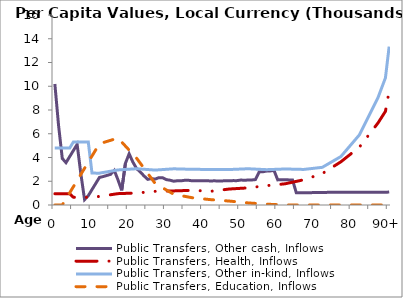
| Category | Public Transfers, Other cash, Inflows | Public Transfers, Health, Inflows | Public Transfers, Other in-kind, Inflows | Public Transfers, Education, Inflows |
|---|---|---|---|---|
| 0 | 10192.285 | 951.171 | 4802.337 | 0 |
|  | 6693.312 | 951 | 4801.83 | 0 |
| 2 | 3918.849 | 951.171 | 4801.421 | 0 |
| 3 | 3564.924 | 951.065 | 4800.856 | 515.8 |
| 4 | 4078.992 | 951.213 | 4800.2 | 1031.6 |
| 5 | 4592.577 | 649.565 | 5312.809 | 1547.4 |
| 6 | 5106.225 | 649.549 | 5311.987 | 2063.201 |
| 7 | 2623.115 | 649.444 | 5311.131 | 2579.001 |
| 8 | 455.655 | 649.627 | 5309.897 | 3094.801 |
| 9 | 785.323 | 649.542 | 5308.728 | 3610.601 |
| 10 | 1299.553 | 664.885 | 2685.057 | 4126.401 |
| 11 | 1810.268 | 680.227 | 2683.96 | 4642.201 |
| 12 | 2321.851 | 726.158 | 2682.705 | 5158.001 |
| 13 | 2394.319 | 772.145 | 2736.489 | 5254.101 |
| 14 | 2488.967 | 818.133 | 2790.274 | 5350.2 |
| 15 | 2580.869 | 864.12 | 2844.058 | 5446.299 |
| 16 | 2911.89 | 910.108 | 2897.842 | 5542.398 |
| 17 | 2113.867 | 956.095 | 2951.627 | 5638.498 |
| 18 | 1233.228 | 967.07 | 2972.153 | 5299.623 |
| 19 | 3514.443 | 978.045 | 2992.679 | 4960.748 |
| 20 | 4309.28 | 989.02 | 3013.205 | 4621.873 |
| 21 | 3618.989 | 999.995 | 3033.732 | 4282.998 |
| 22 | 3072.445 | 1010.97 | 3054.258 | 3944.122 |
| 23 | 2775.366 | 1038.787 | 3031.637 | 3518.538 |
| 24 | 2449.136 | 1066.603 | 3009.016 | 3092.954 |
| 25 | 2160.093 | 1094.42 | 2986.395 | 2667.369 |
| 26 | 2223.691 | 1122.237 | 2963.775 | 2241.785 |
| 27 | 2181.168 | 1150.054 | 2941.154 | 1816.2 |
| 28 | 2303.456 | 1157.267 | 2962.441 | 1633.868 |
| 29 | 2295.225 | 1164.48 | 2983.728 | 1451.536 |
| 30 | 2137.113 | 1171.693 | 3005.015 | 1269.204 |
| 31 | 2088.187 | 1178.906 | 3026.302 | 1086.871 |
| 32 | 2002.898 | 1186.119 | 3047.589 | 904.539 |
| 33 | 2043.235 | 1196.261 | 3038.976 | 845.786 |
| 34 | 2038.398 | 1206.403 | 3030.363 | 787.032 |
| 35 | 2083.539 | 1216.546 | 3021.75 | 728.278 |
| 36 | 2078.951 | 1226.688 | 3013.137 | 669.525 |
| 37 | 2036.462 | 1236.83 | 3004.524 | 610.771 |
| 38 | 2050.653 | 1220.473 | 3002.405 | 578.403 |
| 39 | 2038.372 | 1204.117 | 3000.286 | 546.034 |
| 40 | 2036.489 | 1187.761 | 2998.167 | 513.666 |
| 41 | 2039.519 | 1171.405 | 2996.048 | 481.297 |
| 42 | 2023.48 | 1155.048 | 2993.929 | 448.929 |
| 43 | 2037.082 | 1193.396 | 2992.472 | 425.211 |
| 44 | 2015.535 | 1231.743 | 2991.015 | 401.493 |
| 45 | 2026.245 | 1270.09 | 2989.558 | 377.774 |
| 46 | 2044.974 | 1308.437 | 2988.102 | 354.056 |
| 47 | 2045.449 | 1346.785 | 2986.645 | 330.338 |
| 48 | 2053.087 | 1365.618 | 2999.962 | 299.553 |
| 49 | 2051.296 | 1384.451 | 3013.279 | 268.768 |
| 50 | 2097.752 | 1403.284 | 3026.597 | 237.984 |
| 51 | 2090.502 | 1422.116 | 3039.914 | 207.199 |
| 52 | 2096.857 | 1440.949 | 3053.232 | 176.414 |
| 53 | 2107.94 | 1478.238 | 3037.585 | 154.926 |
| 54 | 2138.089 | 1515.526 | 3021.939 | 133.438 |
| 55 | 2784.181 | 1552.815 | 3006.293 | 111.95 |
| 56 | 2800.02 | 1590.103 | 2990.647 | 90.462 |
| 57 | 2856.491 | 1627.392 | 2975 | 68.974 |
| 58 | 2868.254 | 1659.262 | 2986.691 | 55.179 |
| 59 | 2914.786 | 1691.132 | 2998.382 | 41.385 |
| 60 | 2115.545 | 1723.002 | 3010.073 | 27.59 |
| 61 | 2122.623 | 1754.872 | 3021.764 | 13.795 |
| 62 | 2121.488 | 1786.742 | 3033.455 | 0 |
| 63 | 2114.847 | 1854.108 | 3025.773 | 0 |
| 64 | 2101.681 | 1921.474 | 3018.09 | 0 |
| 65 | 1032.881 | 1988.84 | 3010.408 | 0 |
| 66 | 1027.359 | 2056.206 | 3002.725 | 0 |
| 67 | 1031.739 | 2123.572 | 2995.043 | 0 |
| 68 | 1033.329 | 2228.124 | 3030.471 | 0 |
| 69 | 1039.832 | 2332.676 | 3065.899 | 0 |
| 70 | 1048.114 | 2437.228 | 3101.328 | 0 |
| 71 | 1053.13 | 2541.78 | 3136.756 | 0 |
| 72 | 1058.192 | 2646.332 | 3172.184 | 0 |
| 73 | 1062.128 | 2844.349 | 3353.685 | 0 |
| 74 | 1065.615 | 3042.366 | 3535.186 | 0 |
| 75 | 1066.812 | 3240.382 | 3716.686 | 0 |
| 76 | 1067.684 | 3438.399 | 3898.187 | 0 |
| 77 | 1072.108 | 3636.416 | 4079.688 | 0 |
| 78 | 1073.83 | 3884.487 | 4445.463 | 0 |
| 79 | 1074.035 | 4132.558 | 4811.238 | 0 |
| 80 | 1073.78 | 4380.629 | 5177.013 | 0 |
| 81 | 1073.708 | 4628.7 | 5542.788 | 0 |
| 82 | 1074.715 | 4876.771 | 5908.564 | 0 |
| 83 | 1076.108 | 5282.861 | 6535.573 | 0 |
| 84 | 1075.305 | 5688.951 | 7162.582 | 0 |
| 85 | 1076.227 | 6095.041 | 7789.591 | 0 |
| 86 | 1078.625 | 6501.13 | 8416.6 | 0 |
| 87 | 1079.224 | 6907.22 | 9043.609 | 0 |
| 88 | 1079.16 | 7396.33 | 9874.056 | 0 |
| 89 | 1079.656 | 7885.44 | 10704.503 | 0 |
| 90+ | 1086.802 | 9576.221 | 13339.265 | 0 |